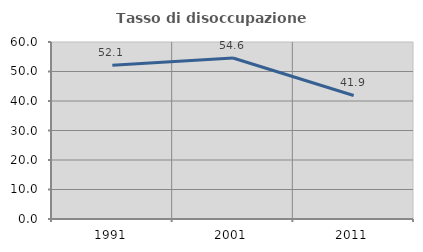
| Category | Tasso di disoccupazione giovanile  |
|---|---|
| 1991.0 | 52.143 |
| 2001.0 | 54.569 |
| 2011.0 | 41.87 |